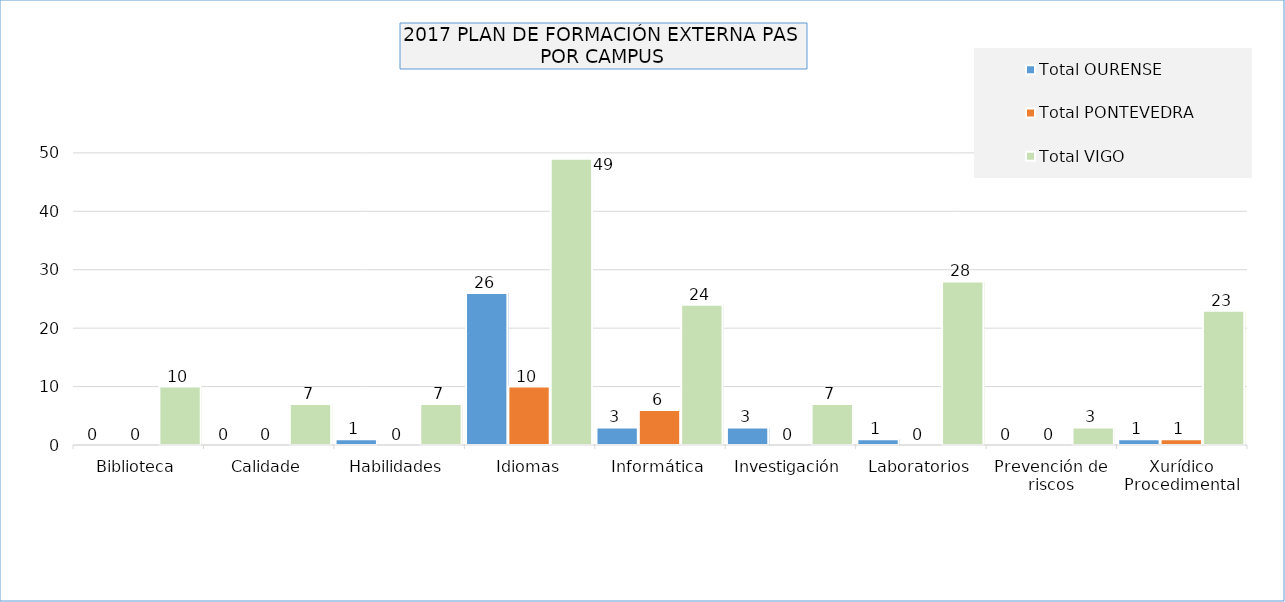
| Category | Total OURENSE | Total PONTEVEDRA | Total VIGO |
|---|---|---|---|
| Biblioteca | 0 | 0 | 10 |
| Calidade | 0 | 0 | 7 |
| Habilidades | 1 | 0 | 7 |
| Idiomas | 26 | 10 | 49 |
| Informática | 3 | 6 | 24 |
| Investigación | 3 | 0 | 7 |
| Laboratorios | 1 | 0 | 28 |
| Prevención de riscos | 0 | 0 | 3 |
| Xurídico Procedimental | 1 | 1 | 23 |